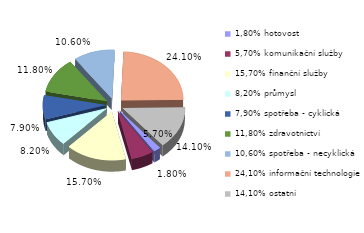
| Category | Series 0 |
|---|---|
| 1,80% hotovost | 0.018 |
| 5,70% komunikační služby | 0.057 |
| 15,70% finanční služby | 0.157 |
| 8,20% průmysl | 0.082 |
| 7,90% spotřeba - cyklická | 0.079 |
| 11,80% zdravotnictví | 0.118 |
| 10,60% spotřeba - necyklická | 0.106 |
| 24,10% informační technologie | 0.241 |
| 14,10% ostatní | 0.141 |